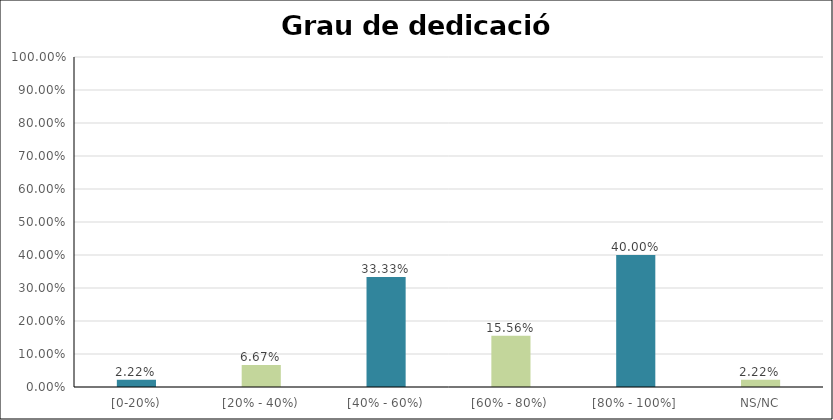
| Category | Series 0 |
|---|---|
| [0-20%) | 0.022 |
| [20% - 40%) | 0.067 |
| [40% - 60%) | 0.333 |
| [60% - 80%) | 0.156 |
| [80% - 100%] | 0.4 |
| NS/NC | 0.022 |